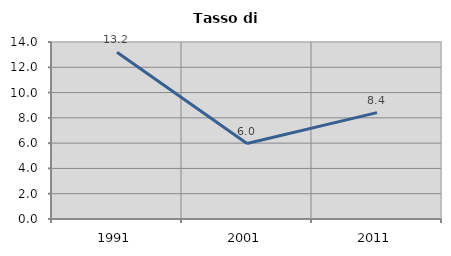
| Category | Tasso di disoccupazione   |
|---|---|
| 1991.0 | 13.184 |
| 2001.0 | 5.966 |
| 2011.0 | 8.415 |